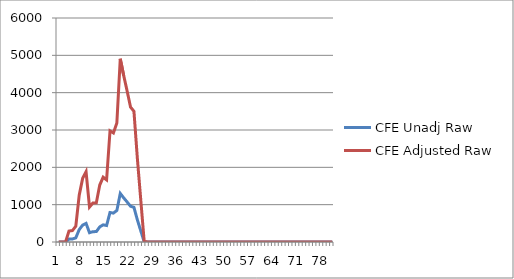
| Category | CFE Unadj Raw | CFE Adjusted Raw |
|---|---|---|
| 0 | 0 | 0 |
| 1 | 0 | 0 |
| 2 | 0 | 0 |
| 3 | 77.613 | 292.783 |
| 4 | 80.978 | 305.478 |
| 5 | 111.659 | 421.218 |
| 6 | 333.181 | 1256.876 |
| 7 | 452 | 1705.101 |
| 8 | 498.907 | 1882.051 |
| 9 | 248.505 | 937.45 |
| 10 | 277.48 | 1046.753 |
| 11 | 278.218 | 1049.537 |
| 12 | 404.346 | 1525.333 |
| 13 | 460.02 | 1735.358 |
| 14 | 441.034 | 1663.735 |
| 15 | 789.531 | 2978.389 |
| 16 | 774.169 | 2920.436 |
| 17 | 844.803 | 3186.892 |
| 18 | 1300.918 | 4907.519 |
| 19 | 1182.085 | 4459.239 |
| 20 | 1072.755 | 4046.808 |
| 21 | 958.158 | 3614.51 |
| 22 | 927.884 | 3500.306 |
| 23 | 592.962 | 2236.861 |
| 24 | 297.786 | 1123.353 |
| 25 | 3.641 | 13.736 |
| 26 | 0.299 | 1.129 |
| 27 | 0 | 0 |
| 28 | 0 | 0 |
| 29 | 0 | 0 |
| 30 | 0 | 0 |
| 31 | 0 | 0 |
| 32 | 0 | 0 |
| 33 | 0 | 0 |
| 34 | 0 | 0 |
| 35 | 0 | 0 |
| 36 | 0 | 0 |
| 37 | 0 | 0 |
| 38 | 0 | 0 |
| 39 | 0 | 0 |
| 40 | 0 | 0 |
| 41 | 0 | 0 |
| 42 | 0 | 0 |
| 43 | 0 | 0 |
| 44 | 0 | 0 |
| 45 | 0 | 0 |
| 46 | 0 | 0 |
| 47 | 0 | 0 |
| 48 | 0 | 0 |
| 49 | 0 | 0 |
| 50 | 0 | 0 |
| 51 | 0 | 0 |
| 52 | 0 | 0 |
| 53 | 0 | 0 |
| 54 | 0 | 0 |
| 55 | 0 | 0 |
| 56 | 0 | 0 |
| 57 | 0 | 0 |
| 58 | 0 | 0 |
| 59 | 0 | 0 |
| 60 | 0 | 0 |
| 61 | 0 | 0 |
| 62 | 0 | 0 |
| 63 | 0 | 0 |
| 64 | 0 | 0 |
| 65 | 0 | 0 |
| 66 | 0 | 0 |
| 67 | 0 | 0 |
| 68 | 0 | 0 |
| 69 | 0 | 0 |
| 70 | 0 | 0 |
| 71 | 0 | 0 |
| 72 | 0 | 0 |
| 73 | 0 | 0 |
| 74 | 0 | 0 |
| 75 | 0 | 0 |
| 76 | 0 | 0 |
| 77 | 0 | 0 |
| 78 | 0 | 0 |
| 79 | 0 | 0 |
| 80 | 0 | 0 |